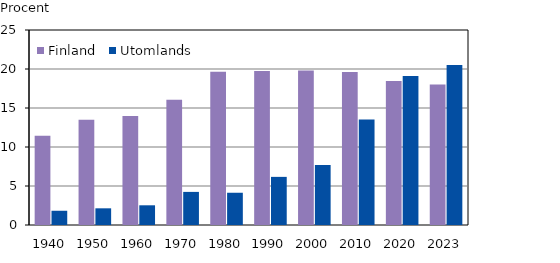
| Category | Finland  | Utomlands |
|---|---|---|
| 1940.0 | 11.455 | 1.826 |
| 1950.0 | 13.49 | 2.139 |
| 1960.0 | 13.965 | 2.526 |
| 1970.0 | 16.046 | 4.244 |
| 1980.0 | 19.651 | 4.135 |
| 1990.0 | 19.741 | 6.17 |
| 2000.0 | 19.821 | 7.701 |
| 2010.0 | 19.602 | 13.514 |
| 2020.0 | 18.467 | 19.111 |
| 2023.0 | 18.018 | 20.507 |